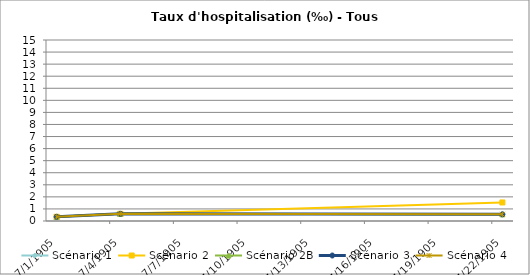
| Category | Scénario 1 | Scénario 2 | Scénario 2B | Scénario 3 | Scénario 4 |
|---|---|---|---|---|---|
| 2009.0 | 0.349 | 0.349 | 0.349 | 0.349 | 0.349 |
| 2012.0 | 0.595 | 0.595 | 0.595 | 0.595 | 0.595 |
| 2030.0 | 0.552 | 1.537 | 0.552 | 0.552 | 0.552 |